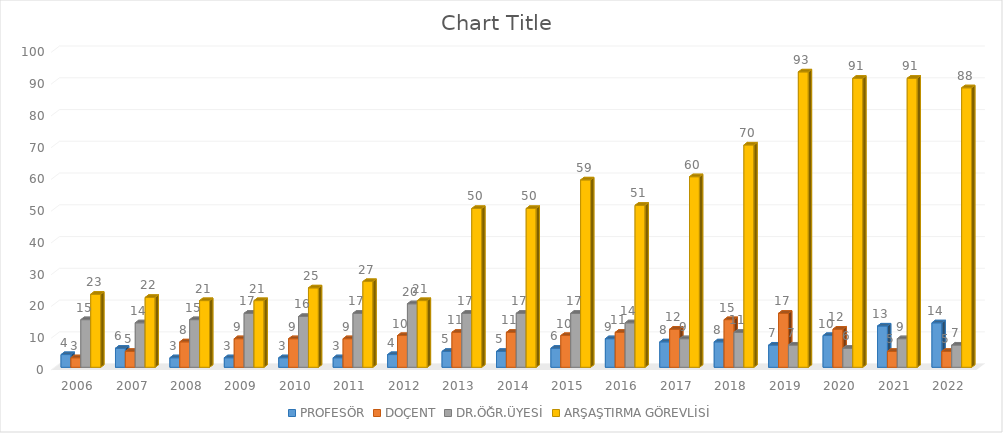
| Category | PROFESÖR | DOÇENT | DR.ÖĞR.ÜYESİ | ARŞAŞTIRMA GÖREVLİSİ |
|---|---|---|---|---|
| 2006.0 | 4 | 3 | 15 | 23 |
| 2007.0 | 6 | 5 | 14 | 22 |
| 2008.0 | 3 | 8 | 15 | 21 |
| 2009.0 | 3 | 9 | 17 | 21 |
| 2010.0 | 3 | 9 | 16 | 25 |
| 2011.0 | 3 | 9 | 17 | 27 |
| 2012.0 | 4 | 10 | 20 | 21 |
| 2013.0 | 5 | 11 | 17 | 50 |
| 2014.0 | 5 | 11 | 17 | 50 |
| 2015.0 | 6 | 10 | 17 | 59 |
| 2016.0 | 9 | 11 | 14 | 51 |
| 2017.0 | 8 | 12 | 9 | 60 |
| 2018.0 | 8 | 15 | 11 | 70 |
| 2019.0 | 7 | 17 | 7 | 93 |
| 2020.0 | 10 | 12 | 6 | 91 |
| 2021.0 | 13 | 5 | 9 | 91 |
| 2022.0 | 14 | 5 | 7 | 88 |